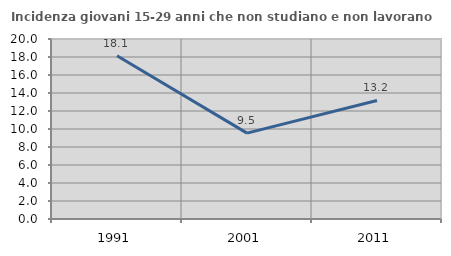
| Category | Incidenza giovani 15-29 anni che non studiano e non lavorano  |
|---|---|
| 1991.0 | 18.136 |
| 2001.0 | 9.544 |
| 2011.0 | 13.171 |